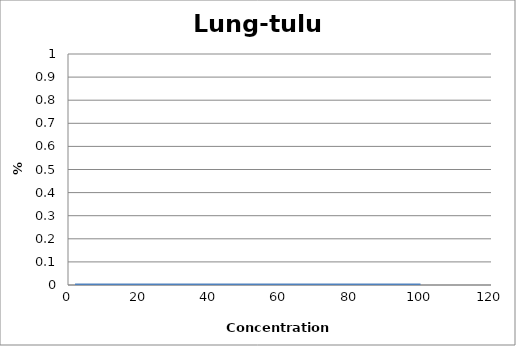
| Category | Lung-tulu4 |
|---|---|
| 100.0 | 0 |
| 50.0 | 0 |
| 20.0 | 0 |
| 2.0 | 0 |
| nan | 0 |
| nan | 0 |
| nan | 0 |
| nan | 0 |
| nan | 0 |